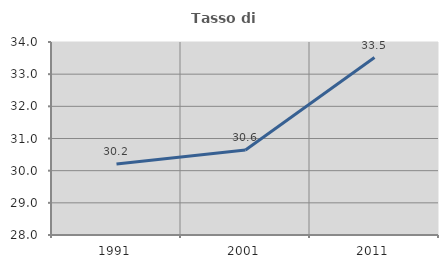
| Category | Tasso di occupazione   |
|---|---|
| 1991.0 | 30.208 |
| 2001.0 | 30.64 |
| 2011.0 | 33.516 |